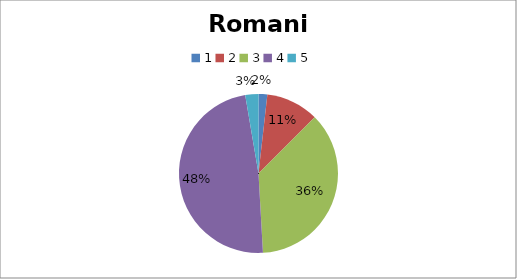
| Category | Romania |
|---|---|
| 0 | 2 |
| 1 | 12 |
| 2 | 41 |
| 3 | 54 |
| 4 | 3 |